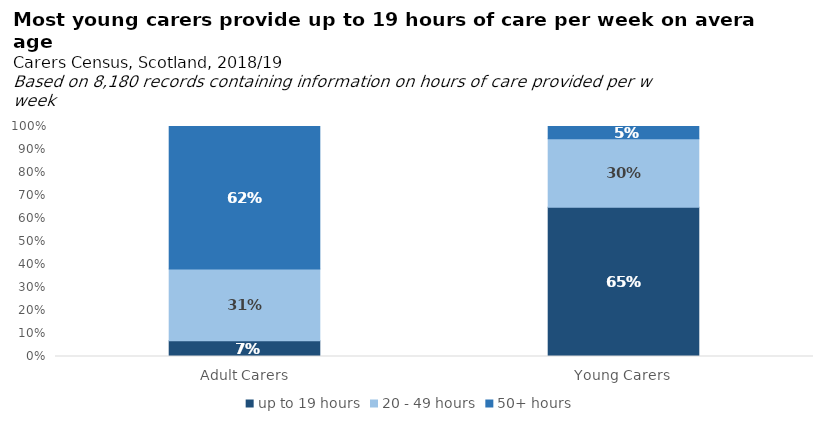
| Category | up to 19 hours | 20 - 49 hours | 50+ hours |
|---|---|---|---|
| Adult Carers | 0.069 | 0.311 | 0.62 |
| Young Carers | 0.649 | 0.298 | 0.053 |